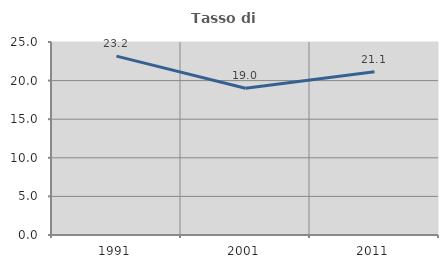
| Category | Tasso di occupazione   |
|---|---|
| 1991.0 | 23.171 |
| 2001.0 | 19.014 |
| 2011.0 | 21.138 |